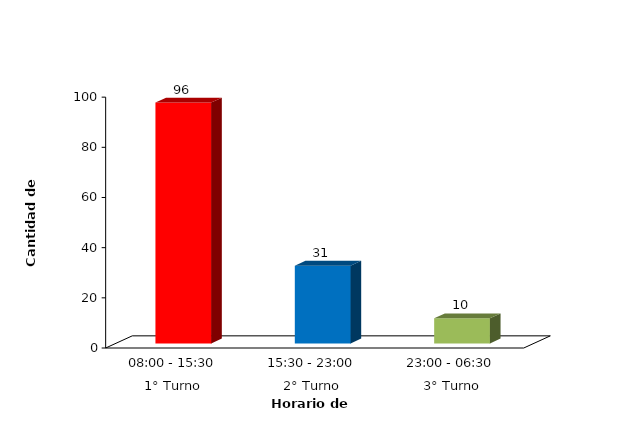
| Category | Series 1 |
|---|---|
| 0 | 96 |
| 1 | 31 |
| 2 | 10 |